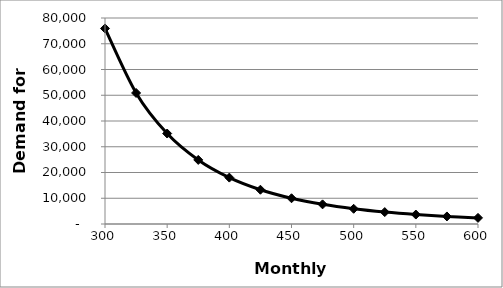
| Category | Demand |
|---|---|
| 300.0 | 75937.5 |
| 325.0 | 50891.56 |
| 350.0 | 35133.575 |
| 375.0 | 24883.2 |
| 400.0 | 18020.325 |
| 425.0 | 13308.157 |
| 450.0 | 10000 |
| 475.0 | 7631.23 |
| 500.0 | 5904.9 |
| 525.0 | 4626.644 |
| 550.0 | 3666.478 |
| 575.0 | 2935.779 |
| 600.0 | 2373.047 |